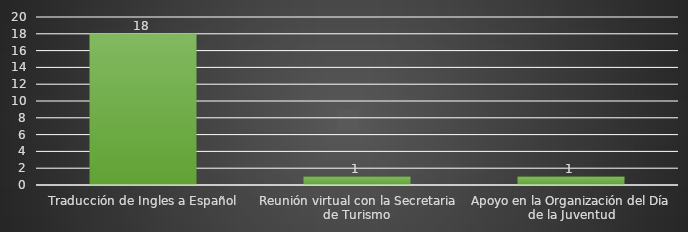
| Category | INDICADOR  |
|---|---|
| Traducción de Ingles a Español | 18 |
| Reunión virtual con la Secretaria de Turismo | 1 |
| Apoyo en la Organización del Día de la Juventud | 1 |